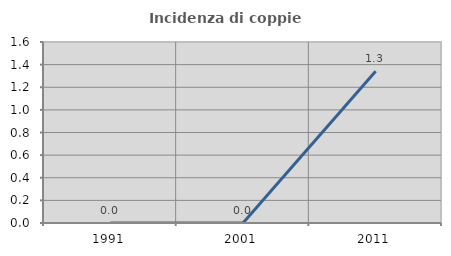
| Category | Incidenza di coppie miste |
|---|---|
| 1991.0 | 0 |
| 2001.0 | 0 |
| 2011.0 | 1.341 |